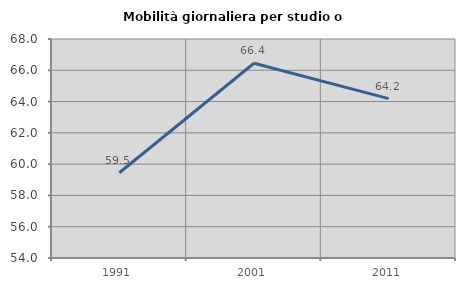
| Category | Mobilità giornaliera per studio o lavoro |
|---|---|
| 1991.0 | 59.451 |
| 2001.0 | 66.448 |
| 2011.0 | 64.187 |